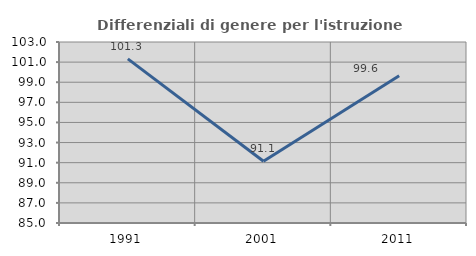
| Category | Differenziali di genere per l'istruzione superiore |
|---|---|
| 1991.0 | 101.326 |
| 2001.0 | 91.135 |
| 2011.0 | 99.636 |